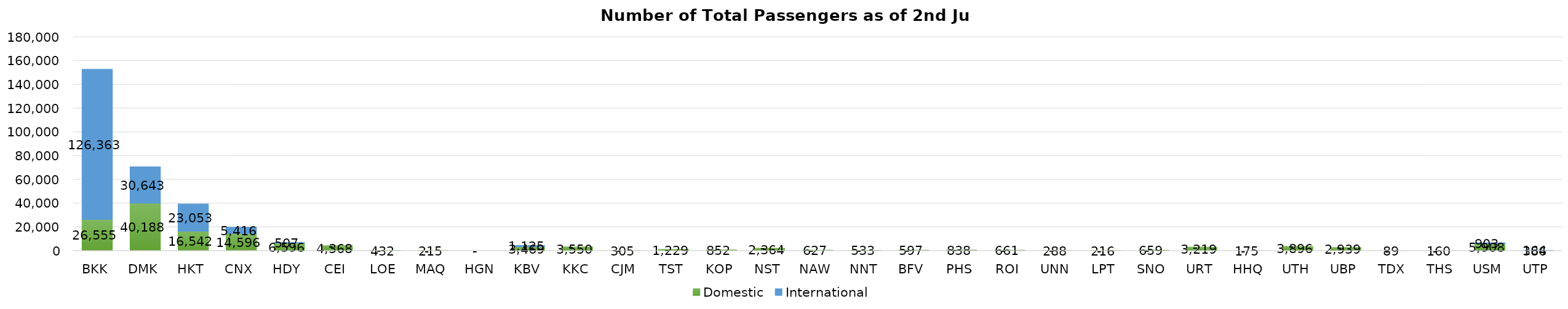
| Category | Domestic | International |
|---|---|---|
| BKK | 26555 | 126363 |
| DMK | 40188 | 30643 |
| HKT | 16542 | 23053 |
| CNX | 14596 | 5416 |
| HDY | 6596 | 507 |
| CEI | 4368 | 0 |
| LOE | 432 | 0 |
| MAQ | 215 | 0 |
| HGN | 0 | 0 |
| KBV | 3469 | 1125 |
| KKC | 3550 | 0 |
| CJM | 305 | 0 |
| TST | 1229 | 0 |
| KOP | 852 | 0 |
| NST | 2364 | 0 |
| NAW | 627 | 0 |
| NNT | 533 | 0 |
| BFV | 597 | 0 |
| PHS | 838 | 0 |
| ROI | 661 | 0 |
| UNN | 288 | 0 |
| LPT | 216 | 0 |
| SNO | 659 | 0 |
| URT | 3219 | 0 |
| HHQ | 175 | 0 |
| UTH | 3896 | 0 |
| UBP | 2939 | 0 |
| TDX | 89 | 0 |
| THS | 160 | 0 |
| USM | 5908 | 903 |
| UTP | 386 | 164 |